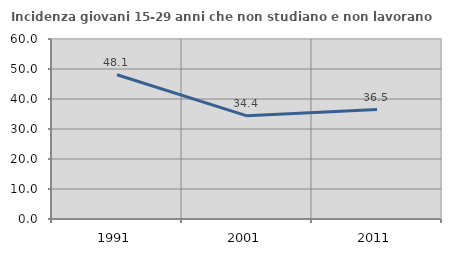
| Category | Incidenza giovani 15-29 anni che non studiano e non lavorano  |
|---|---|
| 1991.0 | 48.075 |
| 2001.0 | 34.382 |
| 2011.0 | 36.496 |